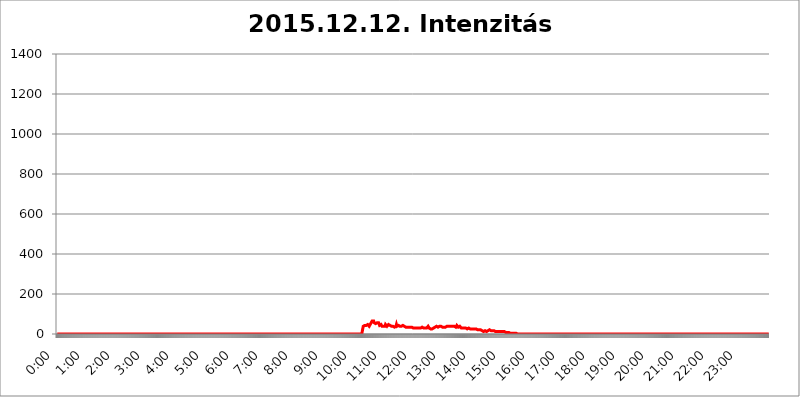
| Category | 2015.12.12. Intenzitás [W/m^2] |
|---|---|
| 0.0 | 0 |
| 0.0006944444444444445 | 0 |
| 0.001388888888888889 | 0 |
| 0.0020833333333333333 | 0 |
| 0.002777777777777778 | 0 |
| 0.003472222222222222 | 0 |
| 0.004166666666666667 | 0 |
| 0.004861111111111111 | 0 |
| 0.005555555555555556 | 0 |
| 0.0062499999999999995 | 0 |
| 0.006944444444444444 | 0 |
| 0.007638888888888889 | 0 |
| 0.008333333333333333 | 0 |
| 0.009027777777777779 | 0 |
| 0.009722222222222222 | 0 |
| 0.010416666666666666 | 0 |
| 0.011111111111111112 | 0 |
| 0.011805555555555555 | 0 |
| 0.012499999999999999 | 0 |
| 0.013194444444444444 | 0 |
| 0.013888888888888888 | 0 |
| 0.014583333333333332 | 0 |
| 0.015277777777777777 | 0 |
| 0.015972222222222224 | 0 |
| 0.016666666666666666 | 0 |
| 0.017361111111111112 | 0 |
| 0.018055555555555557 | 0 |
| 0.01875 | 0 |
| 0.019444444444444445 | 0 |
| 0.02013888888888889 | 0 |
| 0.020833333333333332 | 0 |
| 0.02152777777777778 | 0 |
| 0.022222222222222223 | 0 |
| 0.02291666666666667 | 0 |
| 0.02361111111111111 | 0 |
| 0.024305555555555556 | 0 |
| 0.024999999999999998 | 0 |
| 0.025694444444444447 | 0 |
| 0.02638888888888889 | 0 |
| 0.027083333333333334 | 0 |
| 0.027777777777777776 | 0 |
| 0.02847222222222222 | 0 |
| 0.029166666666666664 | 0 |
| 0.029861111111111113 | 0 |
| 0.030555555555555555 | 0 |
| 0.03125 | 0 |
| 0.03194444444444445 | 0 |
| 0.03263888888888889 | 0 |
| 0.03333333333333333 | 0 |
| 0.034027777777777775 | 0 |
| 0.034722222222222224 | 0 |
| 0.035416666666666666 | 0 |
| 0.036111111111111115 | 0 |
| 0.03680555555555556 | 0 |
| 0.0375 | 0 |
| 0.03819444444444444 | 0 |
| 0.03888888888888889 | 0 |
| 0.03958333333333333 | 0 |
| 0.04027777777777778 | 0 |
| 0.04097222222222222 | 0 |
| 0.041666666666666664 | 0 |
| 0.042361111111111106 | 0 |
| 0.04305555555555556 | 0 |
| 0.043750000000000004 | 0 |
| 0.044444444444444446 | 0 |
| 0.04513888888888889 | 0 |
| 0.04583333333333334 | 0 |
| 0.04652777777777778 | 0 |
| 0.04722222222222222 | 0 |
| 0.04791666666666666 | 0 |
| 0.04861111111111111 | 0 |
| 0.049305555555555554 | 0 |
| 0.049999999999999996 | 0 |
| 0.05069444444444445 | 0 |
| 0.051388888888888894 | 0 |
| 0.052083333333333336 | 0 |
| 0.05277777777777778 | 0 |
| 0.05347222222222222 | 0 |
| 0.05416666666666667 | 0 |
| 0.05486111111111111 | 0 |
| 0.05555555555555555 | 0 |
| 0.05625 | 0 |
| 0.05694444444444444 | 0 |
| 0.057638888888888885 | 0 |
| 0.05833333333333333 | 0 |
| 0.05902777777777778 | 0 |
| 0.059722222222222225 | 0 |
| 0.06041666666666667 | 0 |
| 0.061111111111111116 | 0 |
| 0.06180555555555556 | 0 |
| 0.0625 | 0 |
| 0.06319444444444444 | 0 |
| 0.06388888888888888 | 0 |
| 0.06458333333333334 | 0 |
| 0.06527777777777778 | 0 |
| 0.06597222222222222 | 0 |
| 0.06666666666666667 | 0 |
| 0.06736111111111111 | 0 |
| 0.06805555555555555 | 0 |
| 0.06874999999999999 | 0 |
| 0.06944444444444443 | 0 |
| 0.07013888888888889 | 0 |
| 0.07083333333333333 | 0 |
| 0.07152777777777779 | 0 |
| 0.07222222222222223 | 0 |
| 0.07291666666666667 | 0 |
| 0.07361111111111111 | 0 |
| 0.07430555555555556 | 0 |
| 0.075 | 0 |
| 0.07569444444444444 | 0 |
| 0.0763888888888889 | 0 |
| 0.07708333333333334 | 0 |
| 0.07777777777777778 | 0 |
| 0.07847222222222222 | 0 |
| 0.07916666666666666 | 0 |
| 0.0798611111111111 | 0 |
| 0.08055555555555556 | 0 |
| 0.08125 | 0 |
| 0.08194444444444444 | 0 |
| 0.08263888888888889 | 0 |
| 0.08333333333333333 | 0 |
| 0.08402777777777777 | 0 |
| 0.08472222222222221 | 0 |
| 0.08541666666666665 | 0 |
| 0.08611111111111112 | 0 |
| 0.08680555555555557 | 0 |
| 0.08750000000000001 | 0 |
| 0.08819444444444445 | 0 |
| 0.08888888888888889 | 0 |
| 0.08958333333333333 | 0 |
| 0.09027777777777778 | 0 |
| 0.09097222222222222 | 0 |
| 0.09166666666666667 | 0 |
| 0.09236111111111112 | 0 |
| 0.09305555555555556 | 0 |
| 0.09375 | 0 |
| 0.09444444444444444 | 0 |
| 0.09513888888888888 | 0 |
| 0.09583333333333333 | 0 |
| 0.09652777777777777 | 0 |
| 0.09722222222222222 | 0 |
| 0.09791666666666667 | 0 |
| 0.09861111111111111 | 0 |
| 0.09930555555555555 | 0 |
| 0.09999999999999999 | 0 |
| 0.10069444444444443 | 0 |
| 0.1013888888888889 | 0 |
| 0.10208333333333335 | 0 |
| 0.10277777777777779 | 0 |
| 0.10347222222222223 | 0 |
| 0.10416666666666667 | 0 |
| 0.10486111111111111 | 0 |
| 0.10555555555555556 | 0 |
| 0.10625 | 0 |
| 0.10694444444444444 | 0 |
| 0.1076388888888889 | 0 |
| 0.10833333333333334 | 0 |
| 0.10902777777777778 | 0 |
| 0.10972222222222222 | 0 |
| 0.1111111111111111 | 0 |
| 0.11180555555555556 | 0 |
| 0.11180555555555556 | 0 |
| 0.1125 | 0 |
| 0.11319444444444444 | 0 |
| 0.11388888888888889 | 0 |
| 0.11458333333333333 | 0 |
| 0.11527777777777777 | 0 |
| 0.11597222222222221 | 0 |
| 0.11666666666666665 | 0 |
| 0.1173611111111111 | 0 |
| 0.11805555555555557 | 0 |
| 0.11944444444444445 | 0 |
| 0.12013888888888889 | 0 |
| 0.12083333333333333 | 0 |
| 0.12152777777777778 | 0 |
| 0.12222222222222223 | 0 |
| 0.12291666666666667 | 0 |
| 0.12291666666666667 | 0 |
| 0.12361111111111112 | 0 |
| 0.12430555555555556 | 0 |
| 0.125 | 0 |
| 0.12569444444444444 | 0 |
| 0.12638888888888888 | 0 |
| 0.12708333333333333 | 0 |
| 0.16875 | 0 |
| 0.12847222222222224 | 0 |
| 0.12916666666666668 | 0 |
| 0.12986111111111112 | 0 |
| 0.13055555555555556 | 0 |
| 0.13125 | 0 |
| 0.13194444444444445 | 0 |
| 0.1326388888888889 | 0 |
| 0.13333333333333333 | 0 |
| 0.13402777777777777 | 0 |
| 0.13402777777777777 | 0 |
| 0.13472222222222222 | 0 |
| 0.13541666666666666 | 0 |
| 0.1361111111111111 | 0 |
| 0.13749999999999998 | 0 |
| 0.13819444444444443 | 0 |
| 0.1388888888888889 | 0 |
| 0.13958333333333334 | 0 |
| 0.14027777777777778 | 0 |
| 0.14097222222222222 | 0 |
| 0.14166666666666666 | 0 |
| 0.1423611111111111 | 0 |
| 0.14305555555555557 | 0 |
| 0.14375000000000002 | 0 |
| 0.14444444444444446 | 0 |
| 0.1451388888888889 | 0 |
| 0.1451388888888889 | 0 |
| 0.14652777777777778 | 0 |
| 0.14722222222222223 | 0 |
| 0.14791666666666667 | 0 |
| 0.1486111111111111 | 0 |
| 0.14930555555555555 | 0 |
| 0.15 | 0 |
| 0.15069444444444444 | 0 |
| 0.15138888888888888 | 0 |
| 0.15208333333333332 | 0 |
| 0.15277777777777776 | 0 |
| 0.15347222222222223 | 0 |
| 0.15416666666666667 | 0 |
| 0.15486111111111112 | 0 |
| 0.15555555555555556 | 0 |
| 0.15625 | 0 |
| 0.15694444444444444 | 0 |
| 0.15763888888888888 | 0 |
| 0.15833333333333333 | 0 |
| 0.15902777777777777 | 0 |
| 0.15972222222222224 | 0 |
| 0.16041666666666668 | 0 |
| 0.16111111111111112 | 0 |
| 0.16180555555555556 | 0 |
| 0.1625 | 0 |
| 0.16319444444444445 | 0 |
| 0.1638888888888889 | 0 |
| 0.16458333333333333 | 0 |
| 0.16527777777777777 | 0 |
| 0.16597222222222222 | 0 |
| 0.16666666666666666 | 0 |
| 0.1673611111111111 | 0 |
| 0.16805555555555554 | 0 |
| 0.16874999999999998 | 0 |
| 0.16944444444444443 | 0 |
| 0.17013888888888887 | 0 |
| 0.1708333333333333 | 0 |
| 0.17152777777777775 | 0 |
| 0.17222222222222225 | 0 |
| 0.1729166666666667 | 0 |
| 0.17361111111111113 | 0 |
| 0.17430555555555557 | 0 |
| 0.17500000000000002 | 0 |
| 0.17569444444444446 | 0 |
| 0.1763888888888889 | 0 |
| 0.17708333333333334 | 0 |
| 0.17777777777777778 | 0 |
| 0.17847222222222223 | 0 |
| 0.17916666666666667 | 0 |
| 0.1798611111111111 | 0 |
| 0.18055555555555555 | 0 |
| 0.18125 | 0 |
| 0.18194444444444444 | 0 |
| 0.1826388888888889 | 0 |
| 0.18333333333333335 | 0 |
| 0.1840277777777778 | 0 |
| 0.18472222222222223 | 0 |
| 0.18541666666666667 | 0 |
| 0.18611111111111112 | 0 |
| 0.18680555555555556 | 0 |
| 0.1875 | 0 |
| 0.18819444444444444 | 0 |
| 0.18888888888888888 | 0 |
| 0.18958333333333333 | 0 |
| 0.19027777777777777 | 0 |
| 0.1909722222222222 | 0 |
| 0.19166666666666665 | 0 |
| 0.19236111111111112 | 0 |
| 0.19305555555555554 | 0 |
| 0.19375 | 0 |
| 0.19444444444444445 | 0 |
| 0.1951388888888889 | 0 |
| 0.19583333333333333 | 0 |
| 0.19652777777777777 | 0 |
| 0.19722222222222222 | 0 |
| 0.19791666666666666 | 0 |
| 0.1986111111111111 | 0 |
| 0.19930555555555554 | 0 |
| 0.19999999999999998 | 0 |
| 0.20069444444444443 | 0 |
| 0.20138888888888887 | 0 |
| 0.2020833333333333 | 0 |
| 0.2027777777777778 | 0 |
| 0.2034722222222222 | 0 |
| 0.2041666666666667 | 0 |
| 0.20486111111111113 | 0 |
| 0.20555555555555557 | 0 |
| 0.20625000000000002 | 0 |
| 0.20694444444444446 | 0 |
| 0.2076388888888889 | 0 |
| 0.20833333333333334 | 0 |
| 0.20902777777777778 | 0 |
| 0.20972222222222223 | 0 |
| 0.21041666666666667 | 0 |
| 0.2111111111111111 | 0 |
| 0.21180555555555555 | 0 |
| 0.2125 | 0 |
| 0.21319444444444444 | 0 |
| 0.2138888888888889 | 0 |
| 0.21458333333333335 | 0 |
| 0.2152777777777778 | 0 |
| 0.21597222222222223 | 0 |
| 0.21666666666666667 | 0 |
| 0.21736111111111112 | 0 |
| 0.21805555555555556 | 0 |
| 0.21875 | 0 |
| 0.21944444444444444 | 0 |
| 0.22013888888888888 | 0 |
| 0.22083333333333333 | 0 |
| 0.22152777777777777 | 0 |
| 0.2222222222222222 | 0 |
| 0.22291666666666665 | 0 |
| 0.2236111111111111 | 0 |
| 0.22430555555555556 | 0 |
| 0.225 | 0 |
| 0.22569444444444445 | 0 |
| 0.2263888888888889 | 0 |
| 0.22708333333333333 | 0 |
| 0.22777777777777777 | 0 |
| 0.22847222222222222 | 0 |
| 0.22916666666666666 | 0 |
| 0.2298611111111111 | 0 |
| 0.23055555555555554 | 0 |
| 0.23124999999999998 | 0 |
| 0.23194444444444443 | 0 |
| 0.23263888888888887 | 0 |
| 0.2333333333333333 | 0 |
| 0.2340277777777778 | 0 |
| 0.2347222222222222 | 0 |
| 0.2354166666666667 | 0 |
| 0.23611111111111113 | 0 |
| 0.23680555555555557 | 0 |
| 0.23750000000000002 | 0 |
| 0.23819444444444446 | 0 |
| 0.2388888888888889 | 0 |
| 0.23958333333333334 | 0 |
| 0.24027777777777778 | 0 |
| 0.24097222222222223 | 0 |
| 0.24166666666666667 | 0 |
| 0.2423611111111111 | 0 |
| 0.24305555555555555 | 0 |
| 0.24375 | 0 |
| 0.24444444444444446 | 0 |
| 0.24513888888888888 | 0 |
| 0.24583333333333335 | 0 |
| 0.2465277777777778 | 0 |
| 0.24722222222222223 | 0 |
| 0.24791666666666667 | 0 |
| 0.24861111111111112 | 0 |
| 0.24930555555555556 | 0 |
| 0.25 | 0 |
| 0.25069444444444444 | 0 |
| 0.2513888888888889 | 0 |
| 0.2520833333333333 | 0 |
| 0.25277777777777777 | 0 |
| 0.2534722222222222 | 0 |
| 0.25416666666666665 | 0 |
| 0.2548611111111111 | 0 |
| 0.2555555555555556 | 0 |
| 0.25625000000000003 | 0 |
| 0.2569444444444445 | 0 |
| 0.2576388888888889 | 0 |
| 0.25833333333333336 | 0 |
| 0.2590277777777778 | 0 |
| 0.25972222222222224 | 0 |
| 0.2604166666666667 | 0 |
| 0.2611111111111111 | 0 |
| 0.26180555555555557 | 0 |
| 0.2625 | 0 |
| 0.26319444444444445 | 0 |
| 0.2638888888888889 | 0 |
| 0.26458333333333334 | 0 |
| 0.2652777777777778 | 0 |
| 0.2659722222222222 | 0 |
| 0.26666666666666666 | 0 |
| 0.2673611111111111 | 0 |
| 0.26805555555555555 | 0 |
| 0.26875 | 0 |
| 0.26944444444444443 | 0 |
| 0.2701388888888889 | 0 |
| 0.2708333333333333 | 0 |
| 0.27152777777777776 | 0 |
| 0.2722222222222222 | 0 |
| 0.27291666666666664 | 0 |
| 0.2736111111111111 | 0 |
| 0.2743055555555555 | 0 |
| 0.27499999999999997 | 0 |
| 0.27569444444444446 | 0 |
| 0.27638888888888885 | 0 |
| 0.27708333333333335 | 0 |
| 0.2777777777777778 | 0 |
| 0.27847222222222223 | 0 |
| 0.2791666666666667 | 0 |
| 0.2798611111111111 | 0 |
| 0.28055555555555556 | 0 |
| 0.28125 | 0 |
| 0.28194444444444444 | 0 |
| 0.2826388888888889 | 0 |
| 0.2833333333333333 | 0 |
| 0.28402777777777777 | 0 |
| 0.2847222222222222 | 0 |
| 0.28541666666666665 | 0 |
| 0.28611111111111115 | 0 |
| 0.28680555555555554 | 0 |
| 0.28750000000000003 | 0 |
| 0.2881944444444445 | 0 |
| 0.2888888888888889 | 0 |
| 0.28958333333333336 | 0 |
| 0.2902777777777778 | 0 |
| 0.29097222222222224 | 0 |
| 0.2916666666666667 | 0 |
| 0.2923611111111111 | 0 |
| 0.29305555555555557 | 0 |
| 0.29375 | 0 |
| 0.29444444444444445 | 0 |
| 0.2951388888888889 | 0 |
| 0.29583333333333334 | 0 |
| 0.2965277777777778 | 0 |
| 0.2972222222222222 | 0 |
| 0.29791666666666666 | 0 |
| 0.2986111111111111 | 0 |
| 0.29930555555555555 | 0 |
| 0.3 | 0 |
| 0.30069444444444443 | 0 |
| 0.3013888888888889 | 0 |
| 0.3020833333333333 | 0 |
| 0.30277777777777776 | 0 |
| 0.3034722222222222 | 0 |
| 0.30416666666666664 | 0 |
| 0.3048611111111111 | 0 |
| 0.3055555555555555 | 0 |
| 0.30624999999999997 | 0 |
| 0.3069444444444444 | 0 |
| 0.3076388888888889 | 0 |
| 0.30833333333333335 | 0 |
| 0.3090277777777778 | 0 |
| 0.30972222222222223 | 0 |
| 0.3104166666666667 | 0 |
| 0.3111111111111111 | 0 |
| 0.31180555555555556 | 0 |
| 0.3125 | 0 |
| 0.31319444444444444 | 0 |
| 0.3138888888888889 | 0 |
| 0.3145833333333333 | 0 |
| 0.31527777777777777 | 0 |
| 0.3159722222222222 | 0 |
| 0.31666666666666665 | 0 |
| 0.31736111111111115 | 0 |
| 0.31805555555555554 | 0 |
| 0.31875000000000003 | 0 |
| 0.3194444444444445 | 0 |
| 0.3201388888888889 | 0 |
| 0.32083333333333336 | 0 |
| 0.3215277777777778 | 0 |
| 0.32222222222222224 | 0 |
| 0.3229166666666667 | 0 |
| 0.3236111111111111 | 0 |
| 0.32430555555555557 | 0 |
| 0.325 | 0 |
| 0.32569444444444445 | 0 |
| 0.3263888888888889 | 0 |
| 0.32708333333333334 | 0 |
| 0.3277777777777778 | 0 |
| 0.3284722222222222 | 0 |
| 0.32916666666666666 | 0 |
| 0.3298611111111111 | 0 |
| 0.33055555555555555 | 0 |
| 0.33125 | 0 |
| 0.33194444444444443 | 0 |
| 0.3326388888888889 | 0 |
| 0.3333333333333333 | 0 |
| 0.3340277777777778 | 0 |
| 0.3347222222222222 | 0 |
| 0.3354166666666667 | 0 |
| 0.3361111111111111 | 0 |
| 0.3368055555555556 | 0 |
| 0.33749999999999997 | 0 |
| 0.33819444444444446 | 0 |
| 0.33888888888888885 | 0 |
| 0.33958333333333335 | 0 |
| 0.34027777777777773 | 0 |
| 0.34097222222222223 | 0 |
| 0.3416666666666666 | 0 |
| 0.3423611111111111 | 0 |
| 0.3430555555555555 | 0 |
| 0.34375 | 0 |
| 0.3444444444444445 | 0 |
| 0.3451388888888889 | 0 |
| 0.3458333333333334 | 0 |
| 0.34652777777777777 | 0 |
| 0.34722222222222227 | 0 |
| 0.34791666666666665 | 0 |
| 0.34861111111111115 | 0 |
| 0.34930555555555554 | 0 |
| 0.35000000000000003 | 0 |
| 0.3506944444444444 | 0 |
| 0.3513888888888889 | 0 |
| 0.3520833333333333 | 0 |
| 0.3527777777777778 | 0 |
| 0.3534722222222222 | 0 |
| 0.3541666666666667 | 0 |
| 0.3548611111111111 | 0 |
| 0.35555555555555557 | 0 |
| 0.35625 | 0 |
| 0.35694444444444445 | 0 |
| 0.3576388888888889 | 0 |
| 0.35833333333333334 | 0 |
| 0.3590277777777778 | 0 |
| 0.3597222222222222 | 0 |
| 0.36041666666666666 | 0 |
| 0.3611111111111111 | 0 |
| 0.36180555555555555 | 0 |
| 0.3625 | 0 |
| 0.36319444444444443 | 0 |
| 0.3638888888888889 | 0 |
| 0.3645833333333333 | 0 |
| 0.3652777777777778 | 0 |
| 0.3659722222222222 | 0 |
| 0.3666666666666667 | 0 |
| 0.3673611111111111 | 0 |
| 0.3680555555555556 | 0 |
| 0.36874999999999997 | 0 |
| 0.36944444444444446 | 0 |
| 0.37013888888888885 | 0 |
| 0.37083333333333335 | 0 |
| 0.37152777777777773 | 0 |
| 0.37222222222222223 | 0 |
| 0.3729166666666666 | 0 |
| 0.3736111111111111 | 0 |
| 0.3743055555555555 | 0 |
| 0.375 | 0 |
| 0.3756944444444445 | 0 |
| 0.3763888888888889 | 0 |
| 0.3770833333333334 | 0 |
| 0.37777777777777777 | 0 |
| 0.37847222222222227 | 0 |
| 0.37916666666666665 | 0 |
| 0.37986111111111115 | 0 |
| 0.38055555555555554 | 0 |
| 0.38125000000000003 | 0 |
| 0.3819444444444444 | 0 |
| 0.3826388888888889 | 0 |
| 0.3833333333333333 | 0 |
| 0.3840277777777778 | 0 |
| 0.3847222222222222 | 0 |
| 0.3854166666666667 | 0 |
| 0.3861111111111111 | 0 |
| 0.38680555555555557 | 0 |
| 0.3875 | 0 |
| 0.38819444444444445 | 0 |
| 0.3888888888888889 | 0 |
| 0.38958333333333334 | 0 |
| 0.3902777777777778 | 0 |
| 0.3909722222222222 | 0 |
| 0.39166666666666666 | 0 |
| 0.3923611111111111 | 0 |
| 0.39305555555555555 | 0 |
| 0.39375 | 0 |
| 0.39444444444444443 | 0 |
| 0.3951388888888889 | 0 |
| 0.3958333333333333 | 0 |
| 0.3965277777777778 | 0 |
| 0.3972222222222222 | 0 |
| 0.3979166666666667 | 0 |
| 0.3986111111111111 | 0 |
| 0.3993055555555556 | 0 |
| 0.39999999999999997 | 0 |
| 0.40069444444444446 | 0 |
| 0.40138888888888885 | 0 |
| 0.40208333333333335 | 0 |
| 0.40277777777777773 | 0 |
| 0.40347222222222223 | 0 |
| 0.4041666666666666 | 0 |
| 0.4048611111111111 | 0 |
| 0.4055555555555555 | 0 |
| 0.40625 | 0 |
| 0.4069444444444445 | 0 |
| 0.4076388888888889 | 0 |
| 0.4083333333333334 | 0 |
| 0.40902777777777777 | 0 |
| 0.40972222222222227 | 0 |
| 0.41041666666666665 | 0 |
| 0.41111111111111115 | 0 |
| 0.41180555555555554 | 0 |
| 0.41250000000000003 | 0 |
| 0.4131944444444444 | 0 |
| 0.4138888888888889 | 0 |
| 0.4145833333333333 | 0 |
| 0.4152777777777778 | 0 |
| 0.4159722222222222 | 0 |
| 0.4166666666666667 | 0 |
| 0.4173611111111111 | 0 |
| 0.41805555555555557 | 0 |
| 0.41875 | 0 |
| 0.41944444444444445 | 0 |
| 0.4201388888888889 | 0 |
| 0.42083333333333334 | 0 |
| 0.4215277777777778 | 0 |
| 0.4222222222222222 | 0 |
| 0.42291666666666666 | 0 |
| 0.4236111111111111 | 0 |
| 0.42430555555555555 | 0 |
| 0.425 | 0 |
| 0.42569444444444443 | 0 |
| 0.4263888888888889 | 0 |
| 0.4270833333333333 | 0 |
| 0.4277777777777778 | 0 |
| 0.4284722222222222 | 0 |
| 0.4291666666666667 | 38.653 |
| 0.4298611111111111 | 43.079 |
| 0.4305555555555556 | 43.079 |
| 0.43124999999999997 | 43.079 |
| 0.43194444444444446 | 43.079 |
| 0.43263888888888885 | 38.653 |
| 0.43333333333333335 | 43.079 |
| 0.43402777777777773 | 38.653 |
| 0.43472222222222223 | 38.653 |
| 0.4354166666666666 | 47.511 |
| 0.4361111111111111 | 47.511 |
| 0.4368055555555555 | 43.079 |
| 0.4375 | 38.653 |
| 0.4381944444444445 | 43.079 |
| 0.4388888888888889 | 47.511 |
| 0.4395833333333334 | 47.511 |
| 0.44027777777777777 | 56.398 |
| 0.44097222222222227 | 56.398 |
| 0.44166666666666665 | 65.31 |
| 0.44236111111111115 | 60.85 |
| 0.44305555555555554 | 60.85 |
| 0.44375000000000003 | 65.31 |
| 0.4444444444444444 | 56.398 |
| 0.4451388888888889 | 56.398 |
| 0.4458333333333333 | 51.951 |
| 0.4465277777777778 | 51.951 |
| 0.4472222222222222 | 56.398 |
| 0.4479166666666667 | 51.951 |
| 0.4486111111111111 | 56.398 |
| 0.44930555555555557 | 51.951 |
| 0.45 | 56.398 |
| 0.45069444444444445 | 56.398 |
| 0.4513888888888889 | 51.951 |
| 0.45208333333333334 | 43.079 |
| 0.4527777777777778 | 43.079 |
| 0.4534722222222222 | 43.079 |
| 0.45416666666666666 | 47.511 |
| 0.4548611111111111 | 47.511 |
| 0.45555555555555555 | 38.653 |
| 0.45625 | 38.653 |
| 0.45694444444444443 | 38.653 |
| 0.4576388888888889 | 38.653 |
| 0.4583333333333333 | 38.653 |
| 0.4590277777777778 | 38.653 |
| 0.4597222222222222 | 38.653 |
| 0.4604166666666667 | 47.511 |
| 0.4611111111111111 | 47.511 |
| 0.4618055555555556 | 43.079 |
| 0.46249999999999997 | 38.653 |
| 0.46319444444444446 | 38.653 |
| 0.46388888888888885 | 43.079 |
| 0.46458333333333335 | 47.511 |
| 0.46527777777777773 | 43.079 |
| 0.46597222222222223 | 43.079 |
| 0.4666666666666666 | 43.079 |
| 0.4673611111111111 | 38.653 |
| 0.4680555555555555 | 38.653 |
| 0.46875 | 38.653 |
| 0.4694444444444445 | 43.079 |
| 0.4701388888888889 | 43.079 |
| 0.4708333333333334 | 38.653 |
| 0.47152777777777777 | 34.234 |
| 0.47222222222222227 | 38.653 |
| 0.47291666666666665 | 34.234 |
| 0.47361111111111115 | 38.653 |
| 0.47430555555555554 | 38.653 |
| 0.47500000000000003 | 38.653 |
| 0.4756944444444444 | 47.511 |
| 0.4763888888888889 | 38.653 |
| 0.4770833333333333 | 38.653 |
| 0.4777777777777778 | 38.653 |
| 0.4784722222222222 | 43.079 |
| 0.4791666666666667 | 43.079 |
| 0.4798611111111111 | 38.653 |
| 0.48055555555555557 | 38.653 |
| 0.48125 | 34.234 |
| 0.48194444444444445 | 38.653 |
| 0.4826388888888889 | 38.653 |
| 0.48333333333333334 | 38.653 |
| 0.4840277777777778 | 43.079 |
| 0.4847222222222222 | 43.079 |
| 0.48541666666666666 | 38.653 |
| 0.4861111111111111 | 38.653 |
| 0.48680555555555555 | 38.653 |
| 0.4875 | 38.653 |
| 0.48819444444444443 | 34.234 |
| 0.4888888888888889 | 34.234 |
| 0.4895833333333333 | 38.653 |
| 0.4902777777777778 | 34.234 |
| 0.4909722222222222 | 34.234 |
| 0.4916666666666667 | 38.653 |
| 0.4923611111111111 | 38.653 |
| 0.4930555555555556 | 34.234 |
| 0.49374999999999997 | 29.823 |
| 0.49444444444444446 | 29.823 |
| 0.49513888888888885 | 34.234 |
| 0.49583333333333335 | 29.823 |
| 0.49652777777777773 | 34.234 |
| 0.49722222222222223 | 34.234 |
| 0.4979166666666666 | 34.234 |
| 0.4986111111111111 | 29.823 |
| 0.4993055555555555 | 29.823 |
| 0.5 | 29.823 |
| 0.5006944444444444 | 29.823 |
| 0.5013888888888889 | 29.823 |
| 0.5020833333333333 | 29.823 |
| 0.5027777777777778 | 29.823 |
| 0.5034722222222222 | 29.823 |
| 0.5041666666666667 | 29.823 |
| 0.5048611111111111 | 29.823 |
| 0.5055555555555555 | 29.823 |
| 0.50625 | 34.234 |
| 0.5069444444444444 | 29.823 |
| 0.5076388888888889 | 29.823 |
| 0.5083333333333333 | 29.823 |
| 0.5090277777777777 | 29.823 |
| 0.5097222222222222 | 29.823 |
| 0.5104166666666666 | 29.823 |
| 0.5111111111111112 | 34.234 |
| 0.5118055555555555 | 34.234 |
| 0.5125000000000001 | 38.653 |
| 0.5131944444444444 | 34.234 |
| 0.513888888888889 | 29.823 |
| 0.5145833333333333 | 29.823 |
| 0.5152777777777778 | 29.823 |
| 0.5159722222222222 | 29.823 |
| 0.5166666666666667 | 29.823 |
| 0.517361111111111 | 29.823 |
| 0.5180555555555556 | 29.823 |
| 0.5187499999999999 | 34.234 |
| 0.5194444444444445 | 34.234 |
| 0.5201388888888888 | 38.653 |
| 0.5208333333333334 | 34.234 |
| 0.5215277777777778 | 29.823 |
| 0.5222222222222223 | 29.823 |
| 0.5229166666666667 | 25.419 |
| 0.5236111111111111 | 25.419 |
| 0.5243055555555556 | 25.419 |
| 0.525 | 25.419 |
| 0.5256944444444445 | 25.419 |
| 0.5263888888888889 | 29.823 |
| 0.5270833333333333 | 29.823 |
| 0.5277777777777778 | 29.823 |
| 0.5284722222222222 | 34.234 |
| 0.5291666666666667 | 34.234 |
| 0.5298611111111111 | 34.234 |
| 0.5305555555555556 | 34.234 |
| 0.53125 | 38.653 |
| 0.5319444444444444 | 38.653 |
| 0.5326388888888889 | 34.234 |
| 0.5333333333333333 | 34.234 |
| 0.5340277777777778 | 34.234 |
| 0.5347222222222222 | 38.653 |
| 0.5354166666666667 | 38.653 |
| 0.5361111111111111 | 38.653 |
| 0.5368055555555555 | 38.653 |
| 0.5375 | 38.653 |
| 0.5381944444444444 | 38.653 |
| 0.5388888888888889 | 38.653 |
| 0.5395833333333333 | 38.653 |
| 0.5402777777777777 | 34.234 |
| 0.5409722222222222 | 34.234 |
| 0.5416666666666666 | 34.234 |
| 0.5423611111111112 | 34.234 |
| 0.5430555555555555 | 34.234 |
| 0.5437500000000001 | 34.234 |
| 0.5444444444444444 | 34.234 |
| 0.545138888888889 | 34.234 |
| 0.5458333333333333 | 34.234 |
| 0.5465277777777778 | 38.653 |
| 0.5472222222222222 | 38.653 |
| 0.5479166666666667 | 34.234 |
| 0.548611111111111 | 38.653 |
| 0.5493055555555556 | 38.653 |
| 0.5499999999999999 | 38.653 |
| 0.5506944444444445 | 38.653 |
| 0.5513888888888888 | 38.653 |
| 0.5520833333333334 | 38.653 |
| 0.5527777777777778 | 38.653 |
| 0.5534722222222223 | 38.653 |
| 0.5541666666666667 | 38.653 |
| 0.5548611111111111 | 38.653 |
| 0.5555555555555556 | 38.653 |
| 0.55625 | 38.653 |
| 0.5569444444444445 | 38.653 |
| 0.5576388888888889 | 34.234 |
| 0.5583333333333333 | 34.234 |
| 0.5590277777777778 | 34.234 |
| 0.5597222222222222 | 38.653 |
| 0.5604166666666667 | 43.079 |
| 0.5611111111111111 | 38.653 |
| 0.5618055555555556 | 38.653 |
| 0.5625 | 34.234 |
| 0.5631944444444444 | 34.234 |
| 0.5638888888888889 | 34.234 |
| 0.5645833333333333 | 38.653 |
| 0.5652777777777778 | 38.653 |
| 0.5659722222222222 | 34.234 |
| 0.5666666666666667 | 29.823 |
| 0.5673611111111111 | 29.823 |
| 0.5680555555555555 | 29.823 |
| 0.56875 | 29.823 |
| 0.5694444444444444 | 29.823 |
| 0.5701388888888889 | 29.823 |
| 0.5708333333333333 | 29.823 |
| 0.5715277777777777 | 25.419 |
| 0.5722222222222222 | 25.419 |
| 0.5729166666666666 | 29.823 |
| 0.5736111111111112 | 29.823 |
| 0.5743055555555555 | 25.419 |
| 0.5750000000000001 | 25.419 |
| 0.5756944444444444 | 29.823 |
| 0.576388888888889 | 29.823 |
| 0.5770833333333333 | 29.823 |
| 0.5777777777777778 | 29.823 |
| 0.5784722222222222 | 25.419 |
| 0.5791666666666667 | 25.419 |
| 0.579861111111111 | 25.419 |
| 0.5805555555555556 | 25.419 |
| 0.5812499999999999 | 25.419 |
| 0.5819444444444445 | 25.419 |
| 0.5826388888888888 | 25.419 |
| 0.5833333333333334 | 25.419 |
| 0.5840277777777778 | 21.024 |
| 0.5847222222222223 | 21.024 |
| 0.5854166666666667 | 25.419 |
| 0.5861111111111111 | 25.419 |
| 0.5868055555555556 | 25.419 |
| 0.5875 | 25.419 |
| 0.5881944444444445 | 25.419 |
| 0.5888888888888889 | 21.024 |
| 0.5895833333333333 | 21.024 |
| 0.5902777777777778 | 21.024 |
| 0.5909722222222222 | 21.024 |
| 0.5916666666666667 | 21.024 |
| 0.5923611111111111 | 21.024 |
| 0.5930555555555556 | 25.419 |
| 0.59375 | 21.024 |
| 0.5944444444444444 | 21.024 |
| 0.5951388888888889 | 21.024 |
| 0.5958333333333333 | 16.636 |
| 0.5965277777777778 | 16.636 |
| 0.5972222222222222 | 12.257 |
| 0.5979166666666667 | 12.257 |
| 0.5986111111111111 | 12.257 |
| 0.5993055555555555 | 16.636 |
| 0.6 | 16.636 |
| 0.6006944444444444 | 16.636 |
| 0.6013888888888889 | 12.257 |
| 0.6020833333333333 | 12.257 |
| 0.6027777777777777 | 12.257 |
| 0.6034722222222222 | 12.257 |
| 0.6041666666666666 | 16.636 |
| 0.6048611111111112 | 16.636 |
| 0.6055555555555555 | 16.636 |
| 0.6062500000000001 | 21.024 |
| 0.6069444444444444 | 16.636 |
| 0.607638888888889 | 16.636 |
| 0.6083333333333333 | 16.636 |
| 0.6090277777777778 | 16.636 |
| 0.6097222222222222 | 16.636 |
| 0.6104166666666667 | 16.636 |
| 0.611111111111111 | 16.636 |
| 0.6118055555555556 | 16.636 |
| 0.6124999999999999 | 16.636 |
| 0.6131944444444445 | 16.636 |
| 0.6138888888888888 | 16.636 |
| 0.6145833333333334 | 12.257 |
| 0.6152777777777778 | 12.257 |
| 0.6159722222222223 | 12.257 |
| 0.6166666666666667 | 12.257 |
| 0.6173611111111111 | 12.257 |
| 0.6180555555555556 | 12.257 |
| 0.61875 | 12.257 |
| 0.6194444444444445 | 12.257 |
| 0.6201388888888889 | 12.257 |
| 0.6208333333333333 | 12.257 |
| 0.6215277777777778 | 12.257 |
| 0.6222222222222222 | 12.257 |
| 0.6229166666666667 | 12.257 |
| 0.6236111111111111 | 12.257 |
| 0.6243055555555556 | 12.257 |
| 0.625 | 12.257 |
| 0.6256944444444444 | 12.257 |
| 0.6263888888888889 | 12.257 |
| 0.6270833333333333 | 12.257 |
| 0.6277777777777778 | 12.257 |
| 0.6284722222222222 | 12.257 |
| 0.6291666666666667 | 7.887 |
| 0.6298611111111111 | 7.887 |
| 0.6305555555555555 | 7.887 |
| 0.63125 | 7.887 |
| 0.6319444444444444 | 7.887 |
| 0.6326388888888889 | 7.887 |
| 0.6333333333333333 | 7.887 |
| 0.6340277777777777 | 7.887 |
| 0.6347222222222222 | 3.525 |
| 0.6354166666666666 | 3.525 |
| 0.6361111111111112 | 3.525 |
| 0.6368055555555555 | 3.525 |
| 0.6375000000000001 | 3.525 |
| 0.6381944444444444 | 3.525 |
| 0.638888888888889 | 3.525 |
| 0.6395833333333333 | 3.525 |
| 0.6402777777777778 | 3.525 |
| 0.6409722222222222 | 3.525 |
| 0.6416666666666667 | 3.525 |
| 0.642361111111111 | 3.525 |
| 0.6430555555555556 | 3.525 |
| 0.6437499999999999 | 3.525 |
| 0.6444444444444445 | 3.525 |
| 0.6451388888888888 | 3.525 |
| 0.6458333333333334 | 0 |
| 0.6465277777777778 | 0 |
| 0.6472222222222223 | 0 |
| 0.6479166666666667 | 0 |
| 0.6486111111111111 | 0 |
| 0.6493055555555556 | 0 |
| 0.65 | 0 |
| 0.6506944444444445 | 0 |
| 0.6513888888888889 | 0 |
| 0.6520833333333333 | 0 |
| 0.6527777777777778 | 0 |
| 0.6534722222222222 | 0 |
| 0.6541666666666667 | 0 |
| 0.6548611111111111 | 0 |
| 0.6555555555555556 | 0 |
| 0.65625 | 0 |
| 0.6569444444444444 | 0 |
| 0.6576388888888889 | 0 |
| 0.6583333333333333 | 0 |
| 0.6590277777777778 | 0 |
| 0.6597222222222222 | 0 |
| 0.6604166666666667 | 0 |
| 0.6611111111111111 | 0 |
| 0.6618055555555555 | 0 |
| 0.6625 | 0 |
| 0.6631944444444444 | 0 |
| 0.6638888888888889 | 0 |
| 0.6645833333333333 | 0 |
| 0.6652777777777777 | 0 |
| 0.6659722222222222 | 0 |
| 0.6666666666666666 | 0 |
| 0.6673611111111111 | 0 |
| 0.6680555555555556 | 0 |
| 0.6687500000000001 | 0 |
| 0.6694444444444444 | 0 |
| 0.6701388888888888 | 0 |
| 0.6708333333333334 | 0 |
| 0.6715277777777778 | 0 |
| 0.6722222222222222 | 0 |
| 0.6729166666666666 | 0 |
| 0.6736111111111112 | 0 |
| 0.6743055555555556 | 0 |
| 0.6749999999999999 | 0 |
| 0.6756944444444444 | 0 |
| 0.6763888888888889 | 0 |
| 0.6770833333333334 | 0 |
| 0.6777777777777777 | 0 |
| 0.6784722222222223 | 0 |
| 0.6791666666666667 | 0 |
| 0.6798611111111111 | 0 |
| 0.6805555555555555 | 0 |
| 0.68125 | 0 |
| 0.6819444444444445 | 0 |
| 0.6826388888888889 | 0 |
| 0.6833333333333332 | 0 |
| 0.6840277777777778 | 0 |
| 0.6847222222222222 | 0 |
| 0.6854166666666667 | 0 |
| 0.686111111111111 | 0 |
| 0.6868055555555556 | 0 |
| 0.6875 | 0 |
| 0.6881944444444444 | 0 |
| 0.688888888888889 | 0 |
| 0.6895833333333333 | 0 |
| 0.6902777777777778 | 0 |
| 0.6909722222222222 | 0 |
| 0.6916666666666668 | 0 |
| 0.6923611111111111 | 0 |
| 0.6930555555555555 | 0 |
| 0.69375 | 0 |
| 0.6944444444444445 | 0 |
| 0.6951388888888889 | 0 |
| 0.6958333333333333 | 0 |
| 0.6965277777777777 | 0 |
| 0.6972222222222223 | 0 |
| 0.6979166666666666 | 0 |
| 0.6986111111111111 | 0 |
| 0.6993055555555556 | 0 |
| 0.7000000000000001 | 0 |
| 0.7006944444444444 | 0 |
| 0.7013888888888888 | 0 |
| 0.7020833333333334 | 0 |
| 0.7027777777777778 | 0 |
| 0.7034722222222222 | 0 |
| 0.7041666666666666 | 0 |
| 0.7048611111111112 | 0 |
| 0.7055555555555556 | 0 |
| 0.7062499999999999 | 0 |
| 0.7069444444444444 | 0 |
| 0.7076388888888889 | 0 |
| 0.7083333333333334 | 0 |
| 0.7090277777777777 | 0 |
| 0.7097222222222223 | 0 |
| 0.7104166666666667 | 0 |
| 0.7111111111111111 | 0 |
| 0.7118055555555555 | 0 |
| 0.7125 | 0 |
| 0.7131944444444445 | 0 |
| 0.7138888888888889 | 0 |
| 0.7145833333333332 | 0 |
| 0.7152777777777778 | 0 |
| 0.7159722222222222 | 0 |
| 0.7166666666666667 | 0 |
| 0.717361111111111 | 0 |
| 0.7180555555555556 | 0 |
| 0.71875 | 0 |
| 0.7194444444444444 | 0 |
| 0.720138888888889 | 0 |
| 0.7208333333333333 | 0 |
| 0.7215277777777778 | 0 |
| 0.7222222222222222 | 0 |
| 0.7229166666666668 | 0 |
| 0.7236111111111111 | 0 |
| 0.7243055555555555 | 0 |
| 0.725 | 0 |
| 0.7256944444444445 | 0 |
| 0.7263888888888889 | 0 |
| 0.7270833333333333 | 0 |
| 0.7277777777777777 | 0 |
| 0.7284722222222223 | 0 |
| 0.7291666666666666 | 0 |
| 0.7298611111111111 | 0 |
| 0.7305555555555556 | 0 |
| 0.7312500000000001 | 0 |
| 0.7319444444444444 | 0 |
| 0.7326388888888888 | 0 |
| 0.7333333333333334 | 0 |
| 0.7340277777777778 | 0 |
| 0.7347222222222222 | 0 |
| 0.7354166666666666 | 0 |
| 0.7361111111111112 | 0 |
| 0.7368055555555556 | 0 |
| 0.7374999999999999 | 0 |
| 0.7381944444444444 | 0 |
| 0.7388888888888889 | 0 |
| 0.7395833333333334 | 0 |
| 0.7402777777777777 | 0 |
| 0.7409722222222223 | 0 |
| 0.7416666666666667 | 0 |
| 0.7423611111111111 | 0 |
| 0.7430555555555555 | 0 |
| 0.74375 | 0 |
| 0.7444444444444445 | 0 |
| 0.7451388888888889 | 0 |
| 0.7458333333333332 | 0 |
| 0.7465277777777778 | 0 |
| 0.7472222222222222 | 0 |
| 0.7479166666666667 | 0 |
| 0.748611111111111 | 0 |
| 0.7493055555555556 | 0 |
| 0.75 | 0 |
| 0.7506944444444444 | 0 |
| 0.751388888888889 | 0 |
| 0.7520833333333333 | 0 |
| 0.7527777777777778 | 0 |
| 0.7534722222222222 | 0 |
| 0.7541666666666668 | 0 |
| 0.7548611111111111 | 0 |
| 0.7555555555555555 | 0 |
| 0.75625 | 0 |
| 0.7569444444444445 | 0 |
| 0.7576388888888889 | 0 |
| 0.7583333333333333 | 0 |
| 0.7590277777777777 | 0 |
| 0.7597222222222223 | 0 |
| 0.7604166666666666 | 0 |
| 0.7611111111111111 | 0 |
| 0.7618055555555556 | 0 |
| 0.7625000000000001 | 0 |
| 0.7631944444444444 | 0 |
| 0.7638888888888888 | 0 |
| 0.7645833333333334 | 0 |
| 0.7652777777777778 | 0 |
| 0.7659722222222222 | 0 |
| 0.7666666666666666 | 0 |
| 0.7673611111111112 | 0 |
| 0.7680555555555556 | 0 |
| 0.7687499999999999 | 0 |
| 0.7694444444444444 | 0 |
| 0.7701388888888889 | 0 |
| 0.7708333333333334 | 0 |
| 0.7715277777777777 | 0 |
| 0.7722222222222223 | 0 |
| 0.7729166666666667 | 0 |
| 0.7736111111111111 | 0 |
| 0.7743055555555555 | 0 |
| 0.775 | 0 |
| 0.7756944444444445 | 0 |
| 0.7763888888888889 | 0 |
| 0.7770833333333332 | 0 |
| 0.7777777777777778 | 0 |
| 0.7784722222222222 | 0 |
| 0.7791666666666667 | 0 |
| 0.779861111111111 | 0 |
| 0.7805555555555556 | 0 |
| 0.78125 | 0 |
| 0.7819444444444444 | 0 |
| 0.782638888888889 | 0 |
| 0.7833333333333333 | 0 |
| 0.7840277777777778 | 0 |
| 0.7847222222222222 | 0 |
| 0.7854166666666668 | 0 |
| 0.7861111111111111 | 0 |
| 0.7868055555555555 | 0 |
| 0.7875 | 0 |
| 0.7881944444444445 | 0 |
| 0.7888888888888889 | 0 |
| 0.7895833333333333 | 0 |
| 0.7902777777777777 | 0 |
| 0.7909722222222223 | 0 |
| 0.7916666666666666 | 0 |
| 0.7923611111111111 | 0 |
| 0.7930555555555556 | 0 |
| 0.7937500000000001 | 0 |
| 0.7944444444444444 | 0 |
| 0.7951388888888888 | 0 |
| 0.7958333333333334 | 0 |
| 0.7965277777777778 | 0 |
| 0.7972222222222222 | 0 |
| 0.7979166666666666 | 0 |
| 0.7986111111111112 | 0 |
| 0.7993055555555556 | 0 |
| 0.7999999999999999 | 0 |
| 0.8006944444444444 | 0 |
| 0.8013888888888889 | 0 |
| 0.8020833333333334 | 0 |
| 0.8027777777777777 | 0 |
| 0.8034722222222223 | 0 |
| 0.8041666666666667 | 0 |
| 0.8048611111111111 | 0 |
| 0.8055555555555555 | 0 |
| 0.80625 | 0 |
| 0.8069444444444445 | 0 |
| 0.8076388888888889 | 0 |
| 0.8083333333333332 | 0 |
| 0.8090277777777778 | 0 |
| 0.8097222222222222 | 0 |
| 0.8104166666666667 | 0 |
| 0.811111111111111 | 0 |
| 0.8118055555555556 | 0 |
| 0.8125 | 0 |
| 0.8131944444444444 | 0 |
| 0.813888888888889 | 0 |
| 0.8145833333333333 | 0 |
| 0.8152777777777778 | 0 |
| 0.8159722222222222 | 0 |
| 0.8166666666666668 | 0 |
| 0.8173611111111111 | 0 |
| 0.8180555555555555 | 0 |
| 0.81875 | 0 |
| 0.8194444444444445 | 0 |
| 0.8201388888888889 | 0 |
| 0.8208333333333333 | 0 |
| 0.8215277777777777 | 0 |
| 0.8222222222222223 | 0 |
| 0.8229166666666666 | 0 |
| 0.8236111111111111 | 0 |
| 0.8243055555555556 | 0 |
| 0.8250000000000001 | 0 |
| 0.8256944444444444 | 0 |
| 0.8263888888888888 | 0 |
| 0.8270833333333334 | 0 |
| 0.8277777777777778 | 0 |
| 0.8284722222222222 | 0 |
| 0.8291666666666666 | 0 |
| 0.8298611111111112 | 0 |
| 0.8305555555555556 | 0 |
| 0.8312499999999999 | 0 |
| 0.8319444444444444 | 0 |
| 0.8326388888888889 | 0 |
| 0.8333333333333334 | 0 |
| 0.8340277777777777 | 0 |
| 0.8347222222222223 | 0 |
| 0.8354166666666667 | 0 |
| 0.8361111111111111 | 0 |
| 0.8368055555555555 | 0 |
| 0.8375 | 0 |
| 0.8381944444444445 | 0 |
| 0.8388888888888889 | 0 |
| 0.8395833333333332 | 0 |
| 0.8402777777777778 | 0 |
| 0.8409722222222222 | 0 |
| 0.8416666666666667 | 0 |
| 0.842361111111111 | 0 |
| 0.8430555555555556 | 0 |
| 0.84375 | 0 |
| 0.8444444444444444 | 0 |
| 0.845138888888889 | 0 |
| 0.8458333333333333 | 0 |
| 0.8465277777777778 | 0 |
| 0.8472222222222222 | 0 |
| 0.8479166666666668 | 0 |
| 0.8486111111111111 | 0 |
| 0.8493055555555555 | 0 |
| 0.85 | 0 |
| 0.8506944444444445 | 0 |
| 0.8513888888888889 | 0 |
| 0.8520833333333333 | 0 |
| 0.8527777777777777 | 0 |
| 0.8534722222222223 | 0 |
| 0.8541666666666666 | 0 |
| 0.8548611111111111 | 0 |
| 0.8555555555555556 | 0 |
| 0.8562500000000001 | 0 |
| 0.8569444444444444 | 0 |
| 0.8576388888888888 | 0 |
| 0.8583333333333334 | 0 |
| 0.8590277777777778 | 0 |
| 0.8597222222222222 | 0 |
| 0.8604166666666666 | 0 |
| 0.8611111111111112 | 0 |
| 0.8618055555555556 | 0 |
| 0.8624999999999999 | 0 |
| 0.8631944444444444 | 0 |
| 0.8638888888888889 | 0 |
| 0.8645833333333334 | 0 |
| 0.8652777777777777 | 0 |
| 0.8659722222222223 | 0 |
| 0.8666666666666667 | 0 |
| 0.8673611111111111 | 0 |
| 0.8680555555555555 | 0 |
| 0.86875 | 0 |
| 0.8694444444444445 | 0 |
| 0.8701388888888889 | 0 |
| 0.8708333333333332 | 0 |
| 0.8715277777777778 | 0 |
| 0.8722222222222222 | 0 |
| 0.8729166666666667 | 0 |
| 0.873611111111111 | 0 |
| 0.8743055555555556 | 0 |
| 0.875 | 0 |
| 0.8756944444444444 | 0 |
| 0.876388888888889 | 0 |
| 0.8770833333333333 | 0 |
| 0.8777777777777778 | 0 |
| 0.8784722222222222 | 0 |
| 0.8791666666666668 | 0 |
| 0.8798611111111111 | 0 |
| 0.8805555555555555 | 0 |
| 0.88125 | 0 |
| 0.8819444444444445 | 0 |
| 0.8826388888888889 | 0 |
| 0.8833333333333333 | 0 |
| 0.8840277777777777 | 0 |
| 0.8847222222222223 | 0 |
| 0.8854166666666666 | 0 |
| 0.8861111111111111 | 0 |
| 0.8868055555555556 | 0 |
| 0.8875000000000001 | 0 |
| 0.8881944444444444 | 0 |
| 0.8888888888888888 | 0 |
| 0.8895833333333334 | 0 |
| 0.8902777777777778 | 0 |
| 0.8909722222222222 | 0 |
| 0.8916666666666666 | 0 |
| 0.8923611111111112 | 0 |
| 0.8930555555555556 | 0 |
| 0.8937499999999999 | 0 |
| 0.8944444444444444 | 0 |
| 0.8951388888888889 | 0 |
| 0.8958333333333334 | 0 |
| 0.8965277777777777 | 0 |
| 0.8972222222222223 | 0 |
| 0.8979166666666667 | 0 |
| 0.8986111111111111 | 0 |
| 0.8993055555555555 | 0 |
| 0.9 | 0 |
| 0.9006944444444445 | 0 |
| 0.9013888888888889 | 0 |
| 0.9020833333333332 | 0 |
| 0.9027777777777778 | 0 |
| 0.9034722222222222 | 0 |
| 0.9041666666666667 | 0 |
| 0.904861111111111 | 0 |
| 0.9055555555555556 | 0 |
| 0.90625 | 0 |
| 0.9069444444444444 | 0 |
| 0.907638888888889 | 0 |
| 0.9083333333333333 | 0 |
| 0.9090277777777778 | 0 |
| 0.9097222222222222 | 0 |
| 0.9104166666666668 | 0 |
| 0.9111111111111111 | 0 |
| 0.9118055555555555 | 0 |
| 0.9125 | 0 |
| 0.9131944444444445 | 0 |
| 0.9138888888888889 | 0 |
| 0.9145833333333333 | 0 |
| 0.9152777777777777 | 0 |
| 0.9159722222222223 | 0 |
| 0.9166666666666666 | 0 |
| 0.9173611111111111 | 0 |
| 0.9180555555555556 | 0 |
| 0.9187500000000001 | 0 |
| 0.9194444444444444 | 0 |
| 0.9201388888888888 | 0 |
| 0.9208333333333334 | 0 |
| 0.9215277777777778 | 0 |
| 0.9222222222222222 | 0 |
| 0.9229166666666666 | 0 |
| 0.9236111111111112 | 0 |
| 0.9243055555555556 | 0 |
| 0.9249999999999999 | 0 |
| 0.9256944444444444 | 0 |
| 0.9263888888888889 | 0 |
| 0.9270833333333334 | 0 |
| 0.9277777777777777 | 0 |
| 0.9284722222222223 | 0 |
| 0.9291666666666667 | 0 |
| 0.9298611111111111 | 0 |
| 0.9305555555555555 | 0 |
| 0.93125 | 0 |
| 0.9319444444444445 | 0 |
| 0.9326388888888889 | 0 |
| 0.9333333333333332 | 0 |
| 0.9340277777777778 | 0 |
| 0.9347222222222222 | 0 |
| 0.9354166666666667 | 0 |
| 0.936111111111111 | 0 |
| 0.9368055555555556 | 0 |
| 0.9375 | 0 |
| 0.9381944444444444 | 0 |
| 0.938888888888889 | 0 |
| 0.9395833333333333 | 0 |
| 0.9402777777777778 | 0 |
| 0.9409722222222222 | 0 |
| 0.9416666666666668 | 0 |
| 0.9423611111111111 | 0 |
| 0.9430555555555555 | 0 |
| 0.94375 | 0 |
| 0.9444444444444445 | 0 |
| 0.9451388888888889 | 0 |
| 0.9458333333333333 | 0 |
| 0.9465277777777777 | 0 |
| 0.9472222222222223 | 0 |
| 0.9479166666666666 | 0 |
| 0.9486111111111111 | 0 |
| 0.9493055555555556 | 0 |
| 0.9500000000000001 | 0 |
| 0.9506944444444444 | 0 |
| 0.9513888888888888 | 0 |
| 0.9520833333333334 | 0 |
| 0.9527777777777778 | 0 |
| 0.9534722222222222 | 0 |
| 0.9541666666666666 | 0 |
| 0.9548611111111112 | 0 |
| 0.9555555555555556 | 0 |
| 0.9562499999999999 | 0 |
| 0.9569444444444444 | 0 |
| 0.9576388888888889 | 0 |
| 0.9583333333333334 | 0 |
| 0.9590277777777777 | 0 |
| 0.9597222222222223 | 0 |
| 0.9604166666666667 | 0 |
| 0.9611111111111111 | 0 |
| 0.9618055555555555 | 0 |
| 0.9625 | 0 |
| 0.9631944444444445 | 0 |
| 0.9638888888888889 | 0 |
| 0.9645833333333332 | 0 |
| 0.9652777777777778 | 0 |
| 0.9659722222222222 | 0 |
| 0.9666666666666667 | 0 |
| 0.967361111111111 | 0 |
| 0.9680555555555556 | 0 |
| 0.96875 | 0 |
| 0.9694444444444444 | 0 |
| 0.970138888888889 | 0 |
| 0.9708333333333333 | 0 |
| 0.9715277777777778 | 0 |
| 0.9722222222222222 | 0 |
| 0.9729166666666668 | 0 |
| 0.9736111111111111 | 0 |
| 0.9743055555555555 | 0 |
| 0.975 | 0 |
| 0.9756944444444445 | 0 |
| 0.9763888888888889 | 0 |
| 0.9770833333333333 | 0 |
| 0.9777777777777777 | 0 |
| 0.9784722222222223 | 0 |
| 0.9791666666666666 | 0 |
| 0.9798611111111111 | 0 |
| 0.9805555555555556 | 0 |
| 0.9812500000000001 | 0 |
| 0.9819444444444444 | 0 |
| 0.9826388888888888 | 0 |
| 0.9833333333333334 | 0 |
| 0.9840277777777778 | 0 |
| 0.9847222222222222 | 0 |
| 0.9854166666666666 | 0 |
| 0.9861111111111112 | 0 |
| 0.9868055555555556 | 0 |
| 0.9874999999999999 | 0 |
| 0.9881944444444444 | 0 |
| 0.9888888888888889 | 0 |
| 0.9895833333333334 | 0 |
| 0.9902777777777777 | 0 |
| 0.9909722222222223 | 0 |
| 0.9916666666666667 | 0 |
| 0.9923611111111111 | 0 |
| 0.9930555555555555 | 0 |
| 0.99375 | 0 |
| 0.9944444444444445 | 0 |
| 0.9951388888888889 | 0 |
| 0.9958333333333332 | 0 |
| 0.9965277777777778 | 0 |
| 0.9972222222222222 | 0 |
| 0.9979166666666667 | 0 |
| 0.998611111111111 | 0 |
| 0.9993055555555556 | 0 |